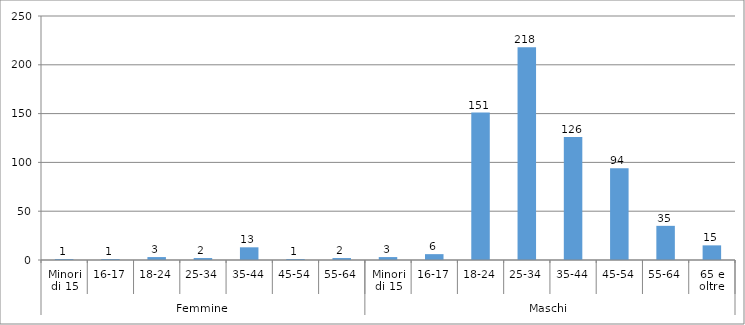
| Category | Series 0 |
|---|---|
| 0 | 1 |
| 1 | 1 |
| 2 | 3 |
| 3 | 2 |
| 4 | 13 |
| 5 | 1 |
| 6 | 2 |
| 7 | 3 |
| 8 | 6 |
| 9 | 151 |
| 10 | 218 |
| 11 | 126 |
| 12 | 94 |
| 13 | 35 |
| 14 | 15 |